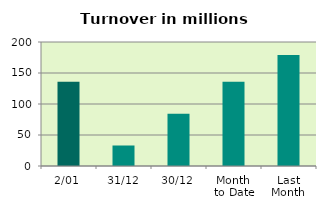
| Category | Series 0 |
|---|---|
| 2/01 | 135.853 |
| 31/12 | 33.071 |
| 30/12 | 84.151 |
| Month 
to Date | 135.853 |
| Last
Month | 179.047 |